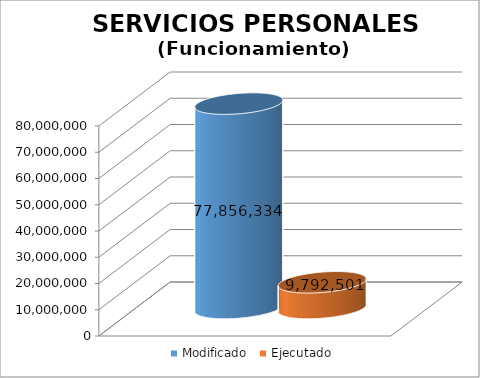
| Category | Modificado | Ejecutado |
|---|---|---|
| 0 | 77856334 | 9792500.94 |